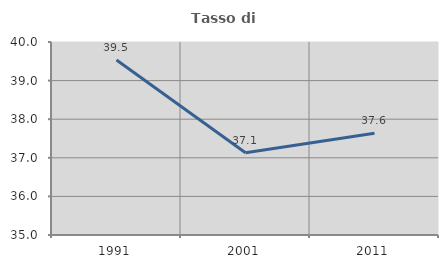
| Category | Tasso di occupazione   |
|---|---|
| 1991.0 | 39.535 |
| 2001.0 | 37.132 |
| 2011.0 | 37.634 |